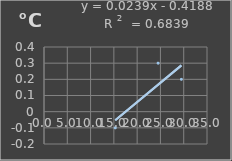
| Category | Temperatura |
|---|---|
| 15.3 | -0.1 |
| 24.5 | 0.3 |
| 29.5 | 0.2 |